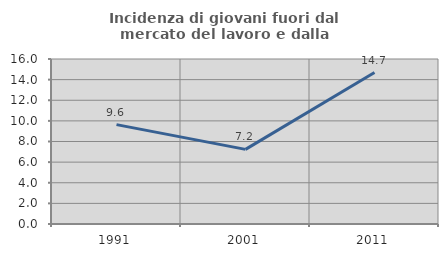
| Category | Incidenza di giovani fuori dal mercato del lavoro e dalla formazione  |
|---|---|
| 1991.0 | 9.639 |
| 2001.0 | 7.237 |
| 2011.0 | 14.685 |